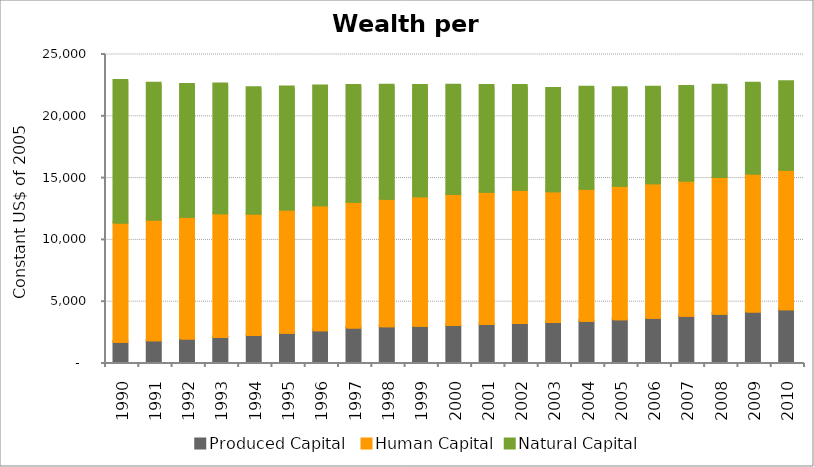
| Category | Produced Capital  | Human Capital | Natural Capital |
|---|---|---|---|
| 1990.0 | 1636.971 | 9654.089 | 11480.636 |
| 1991.0 | 1767.391 | 9753.372 | 11025.642 |
| 1992.0 | 1895.635 | 9846.534 | 10717.507 |
| 1993.0 | 2028.848 | 10005.688 | 10452.005 |
| 1994.0 | 2184.279 | 9840.198 | 10168.981 |
| 1995.0 | 2365.032 | 9969.889 | 9905.269 |
| 1996.0 | 2575.64 | 10111.18 | 9640.439 |
| 1997.0 | 2799.937 | 10165.849 | 9406.056 |
| 1998.0 | 2890.759 | 10325.729 | 9166.256 |
| 1999.0 | 2935.631 | 10474.41 | 8959.044 |
| 2000.0 | 3003.462 | 10594.036 | 8784.14 |
| 2001.0 | 3079.25 | 10691.707 | 8603.508 |
| 2002.0 | 3159.164 | 10777.856 | 8425.301 |
| 2003.0 | 3233.896 | 10581.929 | 8315.639 |
| 2004.0 | 3337.633 | 10683.304 | 8205.172 |
| 2005.0 | 3463.431 | 10787.363 | 7941.407 |
| 2006.0 | 3588.639 | 10869.841 | 7770.131 |
| 2007.0 | 3733.48 | 10960.343 | 7598.351 |
| 2008.0 | 3907.135 | 11053.801 | 7438.038 |
| 2009.0 | 4080.931 | 11171.63 | 7296.188 |
| 2010.0 | 4273.828 | 11270.69 | 7135.403 |